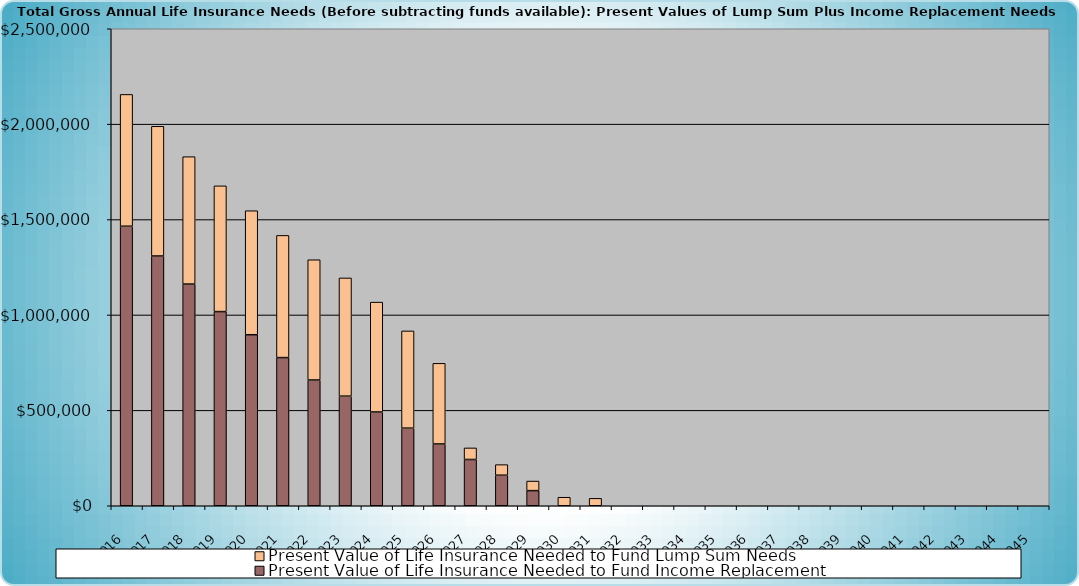
| Category | Present Value of Life Insurance Needed to Fund Income Replacement | Present Value of Life Insurance Needed to Fund Lump Sum Needs |
|---|---|---|
| 2016.0 | 1464993.254 | 690818.72 |
| 2017.0 | 1308993.254 | 679813.857 |
| 2018.0 | 1161877.869 | 667717.162 |
| 2019.0 | 1017591.627 | 659117.928 |
| 2020.0 | 896315.455 | 650032.358 |
| 2021.0 | 776545.145 | 640430.92 |
| 2022.0 | 659078.111 | 630282.194 |
| 2023.0 | 574457.754 | 619552.74 |
| 2024.0 | 491464.711 | 575767.872 |
| 2025.0 | 406838.599 | 509495.581 |
| 2026.0 | 323839.913 | 422662.998 |
| 2027.0 | 242437.355 | 60717.977 |
| 2028.0 | 160050.701 | 55565.158 |
| 2029.0 | 79248.405 | 50214.778 |
| 2030.0 | 0 | 44659.363 |
| 2031.0 | 0 | 38891.158 |
| 2032.0 | 0 | 0 |
| 2033.0 | 0 | 0 |
| 2034.0 | 0 | 0 |
| 2035.0 | 0 | 0 |
| 2036.0 | 0 | 0 |
| 2037.0 | 0 | 0 |
| 2038.0 | 0 | 0 |
| 2039.0 | 0 | 0 |
| 2040.0 | 0 | 0 |
| 2041.0 | 0 | 0 |
| 2042.0 | 0 | 0 |
| 2043.0 | 0 | 0 |
| 2044.0 | 0 | 0 |
| 2045.0 | 0 | 0 |